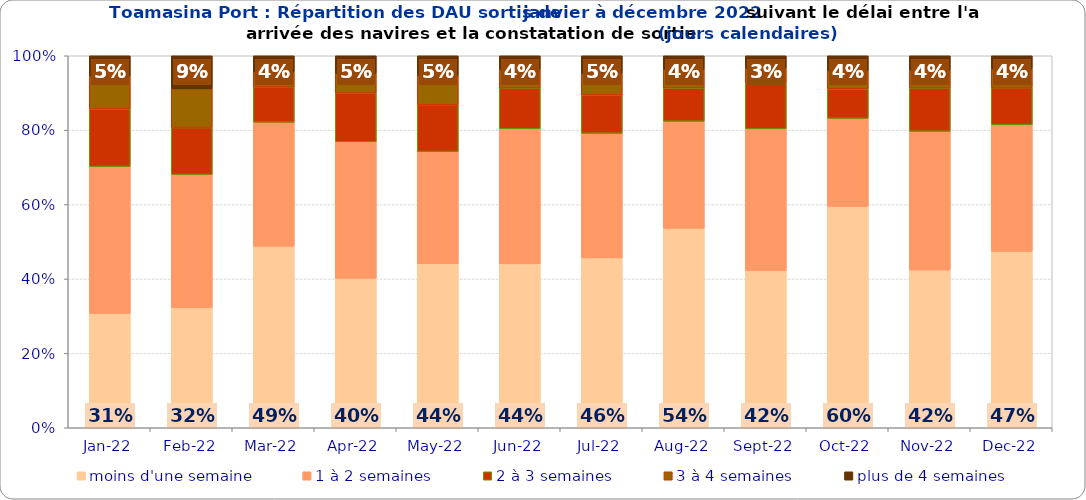
| Category | moins d'une semaine | 1 à 2 semaines | 2 à 3 semaines | 3 à 4 semaines | plus de 4 semaines |
|---|---|---|---|---|---|
| 2022-01-01 | 0.307 | 0.395 | 0.155 | 0.088 | 0.055 |
| 2022-02-01 | 0.323 | 0.358 | 0.126 | 0.104 | 0.089 |
| 2022-03-01 | 0.488 | 0.334 | 0.094 | 0.041 | 0.044 |
| 2022-04-01 | 0.402 | 0.367 | 0.131 | 0.053 | 0.048 |
| 2022-05-01 | 0.441 | 0.302 | 0.126 | 0.078 | 0.054 |
| 2022-06-01 | 0.441 | 0.363 | 0.109 | 0.05 | 0.037 |
| 2022-07-01 | 0.457 | 0.335 | 0.103 | 0.058 | 0.048 |
| 2022-08-01 | 0.536 | 0.288 | 0.09 | 0.05 | 0.037 |
| 2022-09-01 | 0.422 | 0.381 | 0.123 | 0.04 | 0.033 |
| 2022-10-01 | 0.595 | 0.237 | 0.079 | 0.048 | 0.041 |
| 2022-11-01 | 0.424 | 0.373 | 0.116 | 0.048 | 0.039 |
| 2022-12-01 | 0.474 | 0.341 | 0.1 | 0.05 | 0.036 |